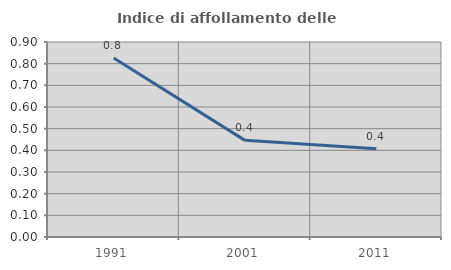
| Category | Indice di affollamento delle abitazioni  |
|---|---|
| 1991.0 | 0.826 |
| 2001.0 | 0.446 |
| 2011.0 | 0.408 |